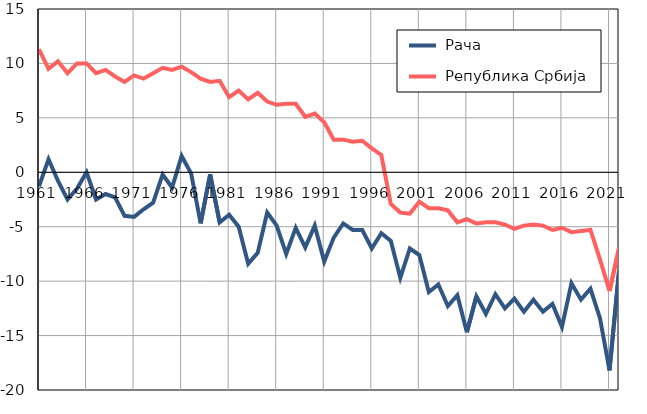
| Category |  Рача |  Република Србија |
|---|---|---|
| 1961.0 | -1.3 | 11.3 |
| 1962.0 | 1.2 | 9.5 |
| 1963.0 | -0.8 | 10.2 |
| 1964.0 | -2.5 | 9.1 |
| 1965.0 | -1.5 | 10 |
| 1966.0 | 0 | 10 |
| 1967.0 | -2.5 | 9.1 |
| 1968.0 | -2 | 9.4 |
| 1969.0 | -2.3 | 8.8 |
| 1970.0 | -4 | 8.3 |
| 1971.0 | -4.1 | 8.9 |
| 1972.0 | -3.4 | 8.6 |
| 1973.0 | -2.8 | 9.1 |
| 1974.0 | -0.2 | 9.6 |
| 1975.0 | -1.4 | 9.4 |
| 1976.0 | 1.5 | 9.7 |
| 1977.0 | -0.1 | 9.2 |
| 1978.0 | -4.7 | 8.6 |
| 1979.0 | -0.2 | 8.3 |
| 1980.0 | -4.6 | 8.4 |
| 1981.0 | -3.9 | 6.9 |
| 1982.0 | -5 | 7.5 |
| 1983.0 | -8.4 | 6.7 |
| 1984.0 | -7.4 | 7.3 |
| 1985.0 | -3.7 | 6.5 |
| 1986.0 | -4.9 | 6.2 |
| 1987.0 | -7.5 | 6.3 |
| 1988.0 | -5.1 | 6.3 |
| 1989.0 | -6.9 | 5.1 |
| 1990.0 | -4.9 | 5.4 |
| 1991.0 | -8.2 | 4.6 |
| 1992.0 | -6 | 3 |
| 1993.0 | -4.7 | 3 |
| 1994.0 | -5.3 | 2.8 |
| 1995.0 | -5.3 | 2.9 |
| 1996.0 | -7 | 2.2 |
| 1997.0 | -5.6 | 1.6 |
| 1998.0 | -6.3 | -2.9 |
| 1999.0 | -9.7 | -3.7 |
| 2000.0 | -7 | -3.8 |
| 2001.0 | -7.6 | -2.7 |
| 2002.0 | -11 | -3.3 |
| 2003.0 | -10.3 | -3.3 |
| 2004.0 | -12.3 | -3.5 |
| 2005.0 | -11.3 | -4.6 |
| 2006.0 | -14.7 | -4.3 |
| 2007.0 | -11.4 | -4.7 |
| 2008.0 | -13 | -4.6 |
| 2009.0 | -11.2 | -4.6 |
| 2010.0 | -12.5 | -4.8 |
| 2011.0 | -11.6 | -5.2 |
| 2012.0 | -12.8 | -4.9 |
| 2013.0 | -11.7 | -4.8 |
| 2014.0 | -12.8 | -4.9 |
| 2015.0 | -12.1 | -5.3 |
| 2016.0 | -14.2 | -5.1 |
| 2017.0 | -10.2 | -5.5 |
| 2018.0 | -11.7 | -5.4 |
| 2019.0 | -10.7 | -5.3 |
| 2020.0 | -13.4 | -8 |
| 2021.0 | -18.2 | -10.9 |
| 2022.0 | -9.1 | -7 |